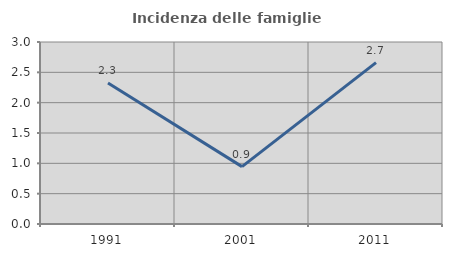
| Category | Incidenza delle famiglie numerose |
|---|---|
| 1991.0 | 2.326 |
| 2001.0 | 0.946 |
| 2011.0 | 2.661 |